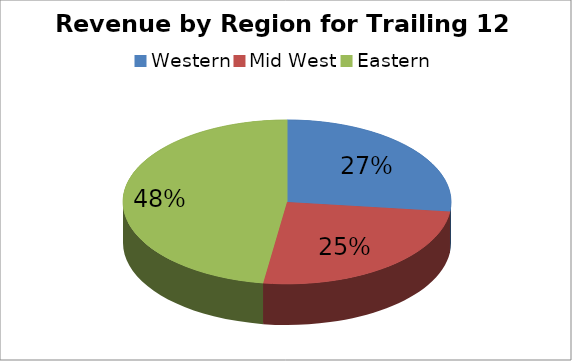
| Category | Series 0 |
|---|---|
| Western | 2031945 |
| Mid West | 1923475 |
| Eastern | 3604672 |